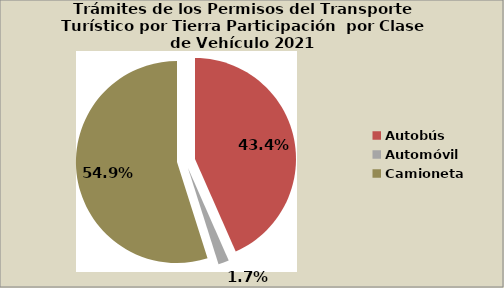
| Category | Series 0 |
|---|---|
| Autobús | 43.397 |
| Automóvil | 1.714 |
| Camioneta | 54.889 |